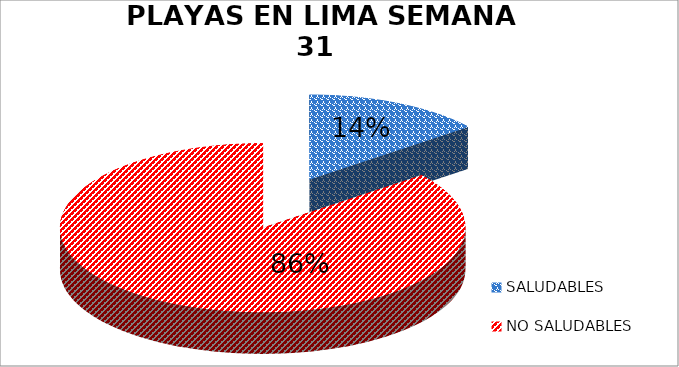
| Category | N.° |
|---|---|
| SALUDABLES | 5 |
| NO SALUDABLES | 30 |